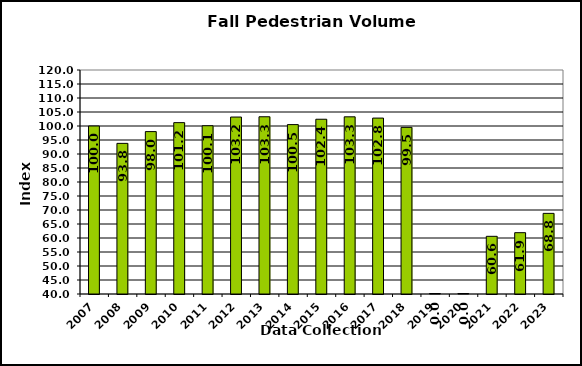
| Category | Series 0 |
|---|---|
| 2007.0 | 100 |
| 2008.0 | 93.8 |
| 2009.0 | 98 |
| 2010.0 | 101.2 |
| 2011.0 | 100.1 |
| 2012.0 | 103.2 |
| 2013.0 | 103.3 |
| 2014.0 | 100.5 |
| 2015.0 | 102.413 |
| 2016.0 | 103.279 |
| 2017.0 | 102.827 |
| 2018.0 | 99.51 |
| 2019.0 | 0 |
| 2020.0 | 0 |
| 2021.0 | 60.6 |
| 2022.0 | 61.9 |
| 2023.0 | 68.8 |